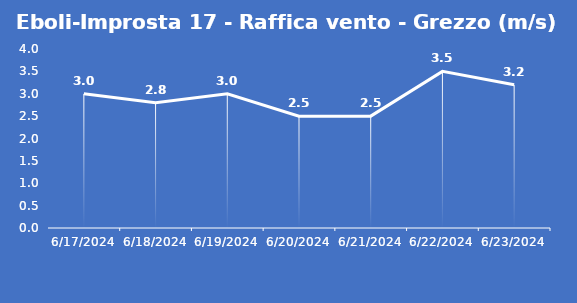
| Category | Eboli-Improsta 17 - Raffica vento - Grezzo (m/s) |
|---|---|
| 6/17/24 | 3 |
| 6/18/24 | 2.8 |
| 6/19/24 | 3 |
| 6/20/24 | 2.5 |
| 6/21/24 | 2.5 |
| 6/22/24 | 3.5 |
| 6/23/24 | 3.2 |